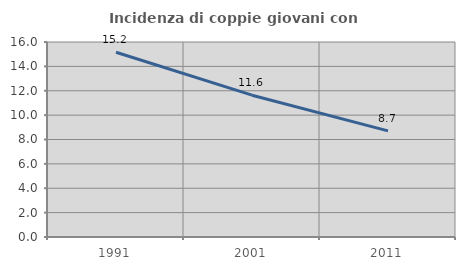
| Category | Incidenza di coppie giovani con figli |
|---|---|
| 1991.0 | 15.162 |
| 2001.0 | 11.636 |
| 2011.0 | 8.711 |